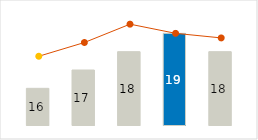
| Category | Other variable cost |
|---|---|
| 0 | 16 |
| 1 | 17 |
| 2 | 18 |
| 3 | 19 |
| 4 | 18 |